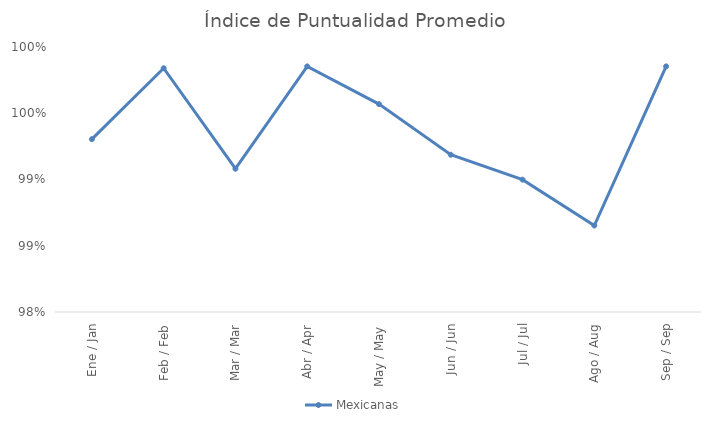
| Category | Mexicanas |
|---|---|
| Ene / Jan | 0.993 |
| Feb / Feb | 0.998 |
| Mar / Mar | 0.991 |
| Abr / Apr | 0.999 |
| May / May | 0.996 |
| Jun / Jun | 0.992 |
| Jul / Jul | 0.99 |
| Ago / Aug | 0.987 |
| Sep / Sep | 0.999 |